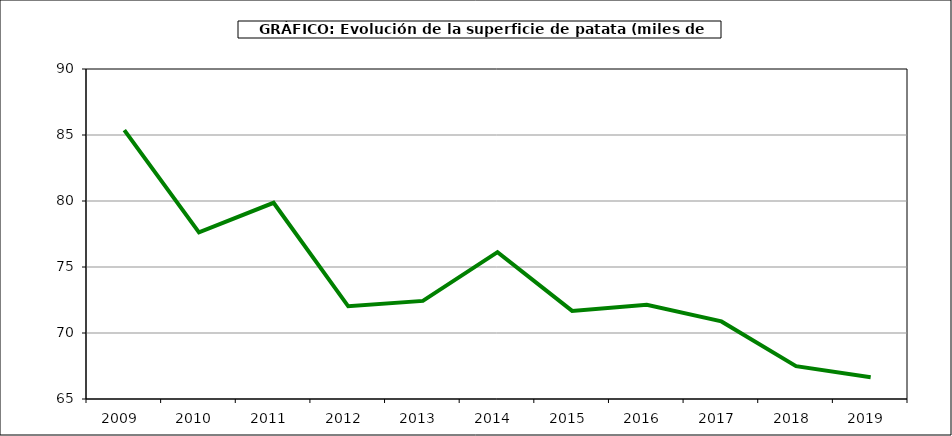
| Category | Superficie |
|---|---|
| 2009.0 | 85.366 |
| 2010.0 | 77.622 |
| 2011.0 | 79.865 |
| 2012.0 | 72.023 |
| 2013.0 | 72.431 |
| 2014.0 | 76.129 |
| 2015.0 | 71.676 |
| 2016.0 | 72.136 |
| 2017.0 | 70.878 |
| 2018.0 | 67.488 |
| 2019.0 | 66.65 |